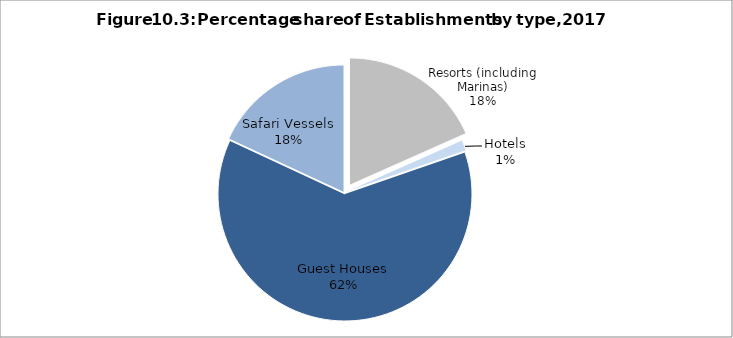
| Category | Series 0 |
|---|---|
| Resorts (including Marinas) | 0.183 |
| Hotels | 0.014 |
| Guest Houses | 0.622 |
| Safari Vessels | 0.181 |